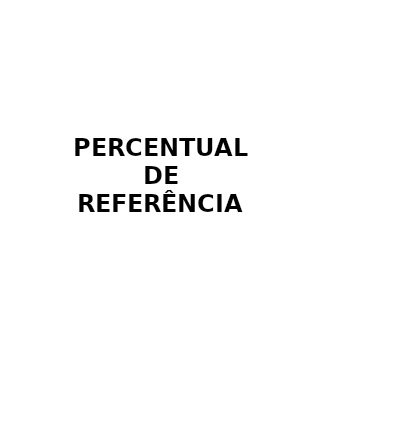
| Category | Series 0 |
|---|---|
| Sim | 0 |
| Não | 0 |
| Dedutível | 0 |